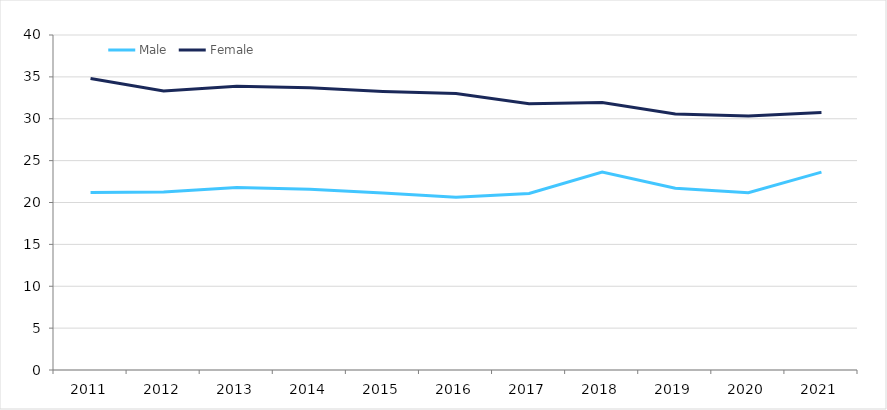
| Category | Male | Female |
|---|---|---|
| 2011.0 | 21.19 | 34.813 |
| 2012.0 | 21.248 | 33.316 |
| 2013.0 | 21.799 | 33.888 |
| 2014.0 | 21.577 | 33.708 |
| 2015.0 | 21.134 | 33.267 |
| 2016.0 | 20.633 | 33.013 |
| 2017.0 | 21.073 | 31.799 |
| 2018.0 | 23.631 | 31.946 |
| 2019.0 | 21.693 | 30.569 |
| 2020.0 | 21.178 | 30.337 |
| 2021.0 | 23.622 | 30.739 |